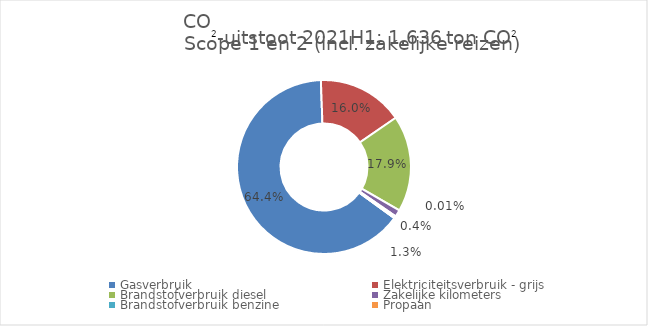
| Category | categorie |
|---|---|
| Gasverbruik | 1113.22 |
| Elektriciteitsverbruik - grijs | 276.489 |
| Brandstofverbruik diesel | 309.071 |
| Zakelijke kilometers | 22.207 |
| Brandstofverbruik benzine | 6.648 |
| Propaan | 0.228 |